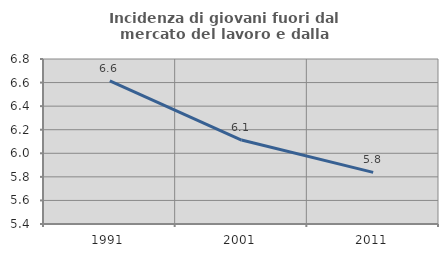
| Category | Incidenza di giovani fuori dal mercato del lavoro e dalla formazione  |
|---|---|
| 1991.0 | 6.614 |
| 2001.0 | 6.113 |
| 2011.0 | 5.838 |